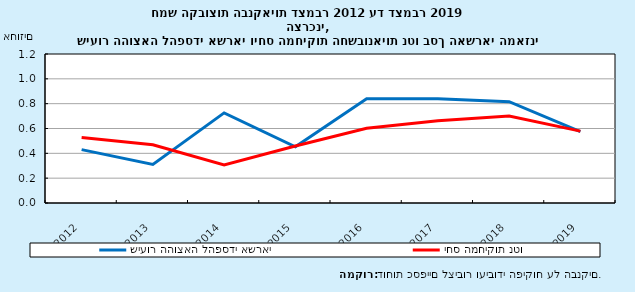
| Category | שיעור ההוצאה להפסדי אשראי  | יחס המחיקות נטו  |
|---|---|---|
| 2012.0 | 0.43 | 0.528 |
| 2013.0 | 0.31 | 0.469 |
| 2014.0 | 0.726 | 0.307 |
| 2015.0 | 0.452 | 0.459 |
| 2016.0 | 0.84 | 0.601 |
| 2017.0 | 0.841 | 0.662 |
| 2018.0 | 0.816 | 0.701 |
| 2019.0 | 0.574 | 0.579 |